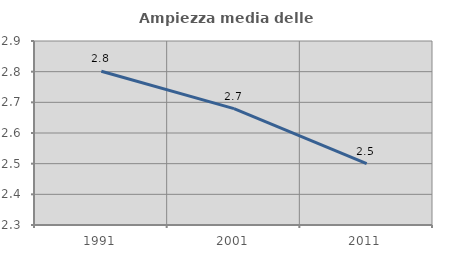
| Category | Ampiezza media delle famiglie |
|---|---|
| 1991.0 | 2.801 |
| 2001.0 | 2.679 |
| 2011.0 | 2.5 |